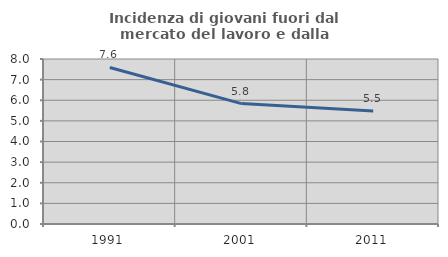
| Category | Incidenza di giovani fuori dal mercato del lavoro e dalla formazione  |
|---|---|
| 1991.0 | 7.59 |
| 2001.0 | 5.839 |
| 2011.0 | 5.482 |